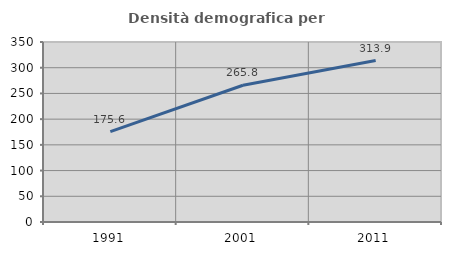
| Category | Densità demografica |
|---|---|
| 1991.0 | 175.587 |
| 2001.0 | 265.824 |
| 2011.0 | 313.91 |